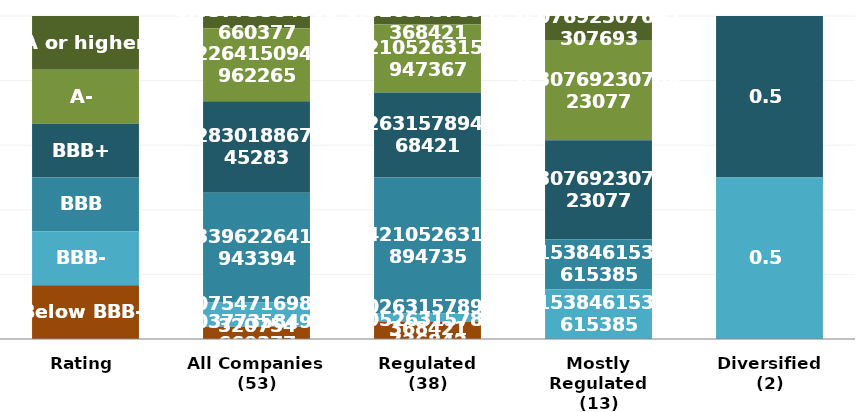
| Category | A or higher | A- | BBB+ | BBB | BBB- | Below BBB- |
|---|---|---|---|---|---|---|
| Rating | 1 | 1 | 1 | 1 | 1 | 1 |
| All Companies
(53) | 2 | 12 | 15 | 18 | 4 | 2 |
| Regulated
(38) | 1 | 8 | 10 | 16 | 1 | 2 |
| Mostly Regulated
(13) | 1 | 4 | 4 | 2 | 2 | 0 |
| Diversified
(2) | 0 | 0 | 1 | 0 | 1 | 0 |